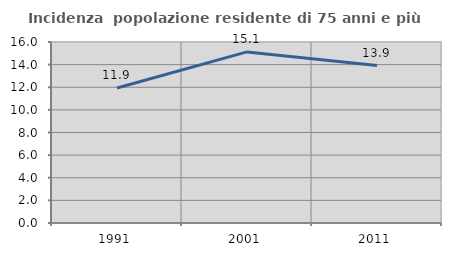
| Category | Incidenza  popolazione residente di 75 anni e più |
|---|---|
| 1991.0 | 11.934 |
| 2001.0 | 15.126 |
| 2011.0 | 13.913 |